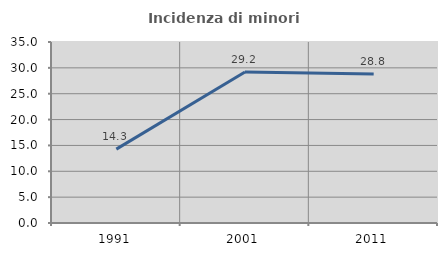
| Category | Incidenza di minori stranieri |
|---|---|
| 1991.0 | 14.286 |
| 2001.0 | 29.204 |
| 2011.0 | 28.836 |